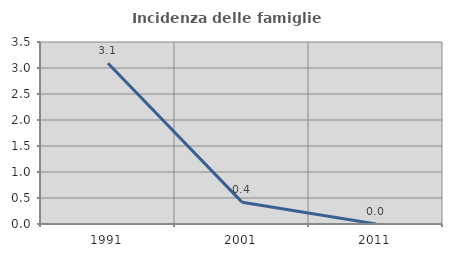
| Category | Incidenza delle famiglie numerose |
|---|---|
| 1991.0 | 3.093 |
| 2001.0 | 0.42 |
| 2011.0 | 0 |